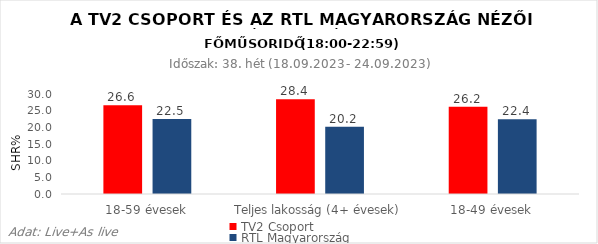
| Category | TV2 Csoport | RTL Magyarország |
|---|---|---|
| 18-59 évesek | 26.6 | 22.5 |
| Teljes lakosság (4+ évesek) | 28.4 | 20.2 |
| 18-49 évesek | 26.2 | 22.4 |